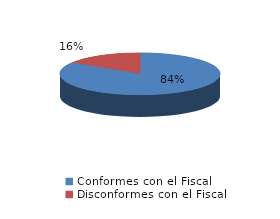
| Category | Series 0 |
|---|---|
| 0 | 85 |
| 1 | 16 |